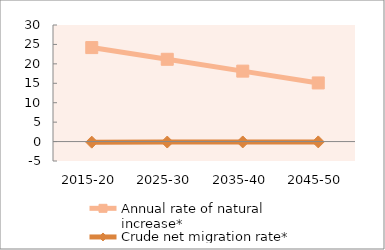
| Category | Annual rate of natural increase* | Crude net migration rate* |
|---|---|---|
| 2015-20 | 24.188 | -0.152 |
| 2025-30 | 21.175 | -0.122 |
| 2035-40 | 18.127 | -0.1 |
| 2045-50 | 15.089 | -0.085 |